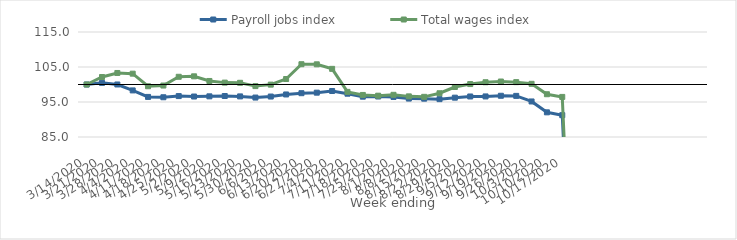
| Category | Payroll jobs index | Total wages index |
|---|---|---|
| 14/03/2020 | 100 | 100 |
| 21/03/2020 | 100.463 | 102.136 |
| 28/03/2020 | 100.005 | 103.292 |
| 04/04/2020 | 98.31 | 103.096 |
| 11/04/2020 | 96.454 | 99.503 |
| 18/04/2020 | 96.357 | 99.702 |
| 25/04/2020 | 96.688 | 102.204 |
| 02/05/2020 | 96.567 | 102.338 |
| 09/05/2020 | 96.619 | 101.007 |
| 16/05/2020 | 96.71 | 100.536 |
| 23/05/2020 | 96.6 | 100.483 |
| 30/05/2020 | 96.27 | 99.544 |
| 06/06/2020 | 96.56 | 99.963 |
| 13/06/2020 | 97.155 | 101.571 |
| 20/06/2020 | 97.514 | 105.798 |
| 27/06/2020 | 97.667 | 105.766 |
| 04/07/2020 | 98.139 | 104.469 |
| 11/07/2020 | 97.371 | 97.894 |
| 18/07/2020 | 96.518 | 97.018 |
| 25/07/2020 | 96.569 | 96.801 |
| 01/08/2020 | 96.44 | 97.05 |
| 08/08/2020 | 95.979 | 96.609 |
| 15/08/2020 | 95.95 | 96.475 |
| 22/08/2020 | 95.813 | 97.5 |
| 29/08/2020 | 96.241 | 99.288 |
| 05/09/2020 | 96.58 | 100.122 |
| 12/09/2020 | 96.592 | 100.647 |
| 19/09/2020 | 96.781 | 100.852 |
| 26/09/2020 | 96.746 | 100.674 |
| 03/10/2020 | 95.154 | 100.194 |
| 10/10/2020 | 92.047 | 97.22 |
| 17/10/2020 | 91.228 | 96.452 |